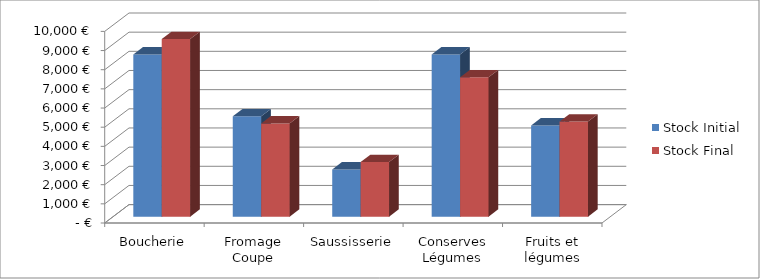
| Category | Stock Initial | Stock Final |
|---|---|---|
| Boucherie | 8465 | 9272 |
| Fromage Coupe | 5240 | 4867 |
| Saussisserie | 2467 | 2854 |
| Conserves Légumes | 8465 | 7272 |
| Fruits et légumes | 4764 | 4961 |